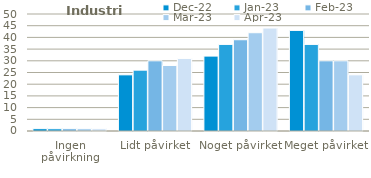
| Category | dec-22 | jan-23 | feb-23 | mar-23 | apr-23 |
|---|---|---|---|---|---|
| Ingen påvirkning | 1 | 1 | 1 | 1 | 1 |
| Lidt påvirket | 24 | 26 | 30 | 28 | 31 |
| Noget påvirket | 32 | 37 | 39 | 42 | 44 |
| Meget påvirket | 43 | 37 | 30 | 30 | 24 |